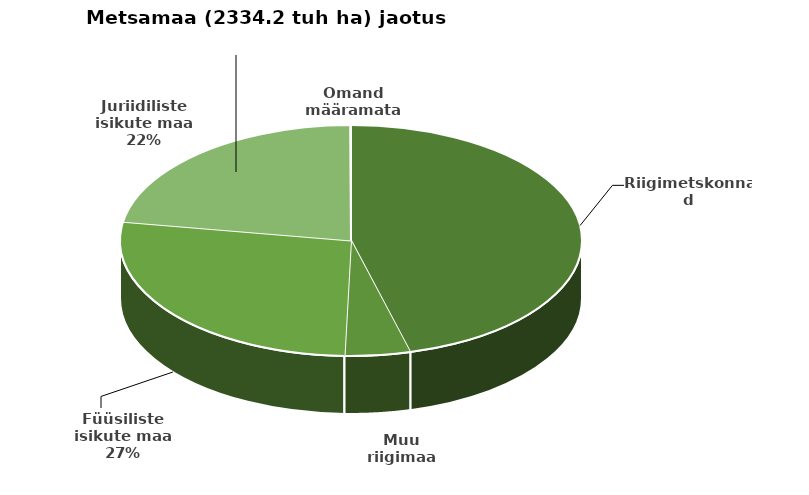
| Category | metsamaa omandivormid |  1 sealhulgas munitsipaalmaa  2 sealhulgas kirikute-koguduste maa |
|---|---|---|
| Riigimetskonnad | 1070.744 |  |
| Muu riigimaa | 106.741 |  |
| Füüsiliste isikute maa | 633.508 |  |
| Juriidiliste isikute maa | 521.864 |  |
| Omand määramata | 1.32 |  |